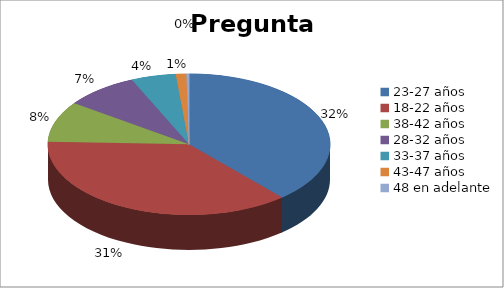
| Category | Series 0 |
|---|---|
| 23-27 años | 0.32 |
| 18-22 años | 0.308 |
| 38-42 años | 0.078 |
| 28-32 años | 0.07 |
| 33-37 años | 0.042 |
| 43-47 años | 0.01 |
| 48 en adelante | 0.002 |